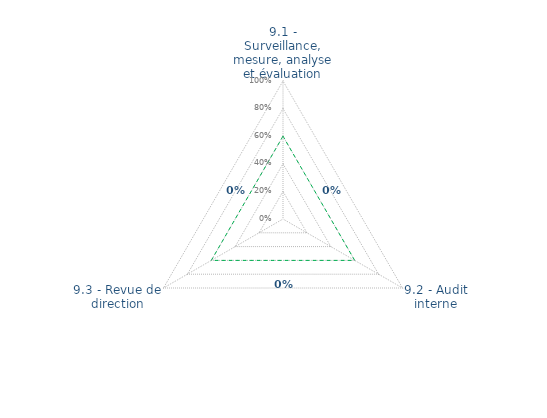
| Category | Art. 9 | limite de CONFORMITÉ |
|---|---|---|
| 9.1 - Surveillance, mesure, analyse et évaluation | 0 | 0.6 |
| 9.2 - Audit interne | 0 | 0.6 |
| 9.3 - Revue de direction | 0 | 0.6 |